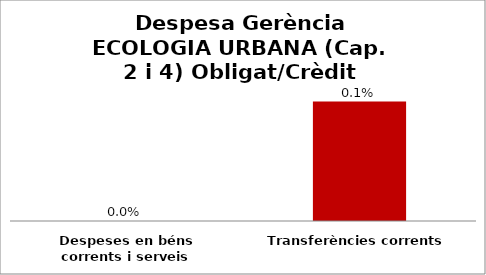
| Category | Series 0 |
|---|---|
| Despeses en béns corrents i serveis | 0 |
| Transferències corrents | 0.001 |